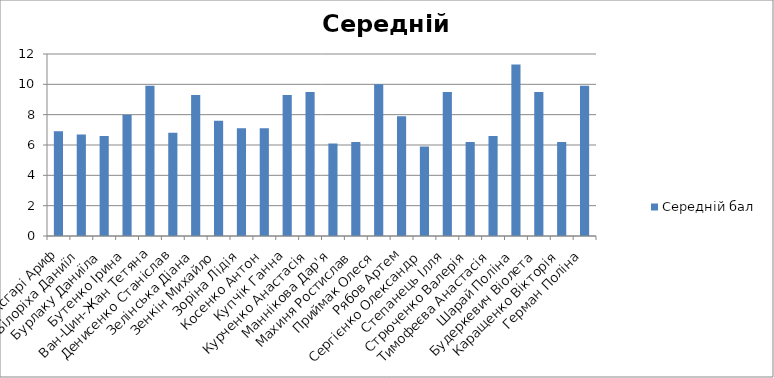
| Category | Середній бал |
|---|---|
| Асгарі Ариф | 6.9 |
| Білоріха Даниїл | 6.7 |
| Бурлаку Даниїла | 6.6 |
| Бутенко Ірина | 8 |
| Ван-Цин-Жан Тетяна | 9.9 |
| Денисенко Станіслав | 6.8 |
| Зелінська Діана | 9.3 |
| Зенкін Михайло | 7.6 |
| Зоріна Лідія  | 7.1 |
| Косенко Антон | 7.1 |
| Купчік Ганна | 9.3 |
| Курченко Анастасія | 9.5 |
| Маннікова Дар'я | 6.1 |
| Махиня Ростислав | 6.2 |
| Приймак Олеся | 10 |
| Рябов Артем | 7.9 |
| Сергієнко Олександр | 5.9 |
| Степанець Ілля | 9.5 |
| Стрюченко Валерія | 6.2 |
| Тимофеєва Анастасія | 6.6 |
| Шарай Поліна | 11.3 |
| Будеркевич Віолета | 9.5 |
| Каращенко Вікторія | 6.2 |
| Герман Поліна | 9.9 |